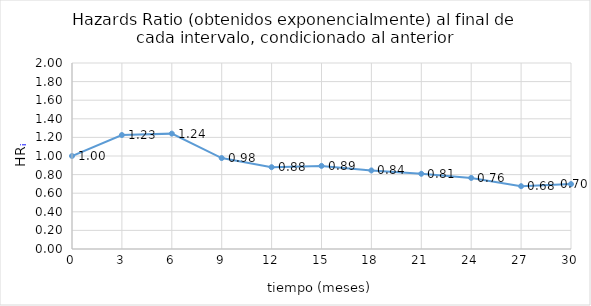
| Category | Series 0 |
|---|---|
| 0.0 | 1 |
| 3.0 | 1.225 |
| 6.0 | 1.241 |
| 9.0 | 0.978 |
| 12.0 | 0.88 |
| 15.0 | 0.894 |
| 18.0 | 0.845 |
| 21.0 | 0.809 |
| 24.0 | 0.764 |
| 27.0 | 0.675 |
| 30.0 | 0.698 |